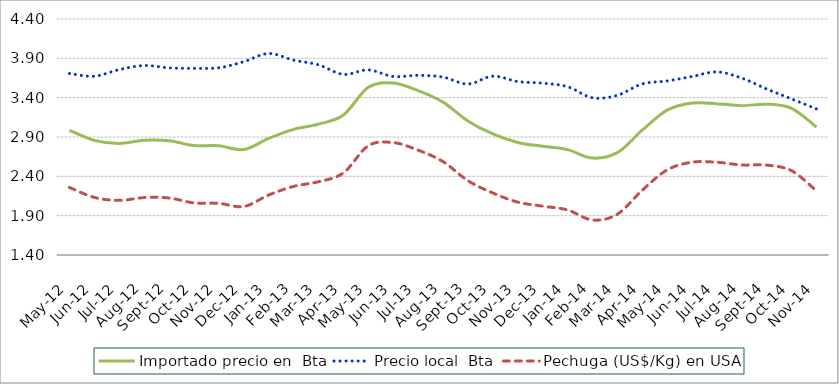
| Category | Importado precio en  Bta  | Precio local  Bta  | Pechuga (US$/Kg) en USA |
|---|---|---|---|
| 2012-05-01 | 2.985 | 3.708 | 2.259 |
| 2012-06-01 | 2.857 | 3.673 | 2.132 |
| 2012-07-01 | 2.817 | 3.757 | 2.094 |
| 2012-08-01 | 2.859 | 3.808 | 2.13 |
| 2012-09-01 | 2.852 | 3.779 | 2.125 |
| 2012-10-01 | 2.791 | 3.772 | 2.063 |
| 2012-11-01 | 2.789 | 3.78 | 2.057 |
| 2012-12-01 | 2.741 | 3.857 | 2.016 |
| 2013-01-01 | 2.882 | 3.961 | 2.163 |
| 2013-02-01 | 2.997 | 3.877 | 2.272 |
| 2013-03-01 | 3.063 | 3.817 | 2.331 |
| 2013-04-01 | 3.18 | 3.696 | 2.443 |
| 2013-05-01 | 3.532 | 3.753 | 2.789 |
| 2013-06-01 | 3.588 | 3.669 | 2.829 |
| 2013-07-01 | 3.489 | 3.684 | 2.733 |
| 2013-08-01 | 3.343 | 3.662 | 2.587 |
| 2013-09-01 | 3.104 | 3.574 | 2.345 |
| 2013-10-01 | 2.938 | 3.673 | 2.189 |
| 2013-11-01 | 2.831 | 3.605 | 2.072 |
| 2013-12-01 | 2.782 | 3.584 | 2.021 |
| 2014-01-01 | 2.74 | 3.54 | 1.972 |
| 2014-02-01 | 2.633 | 3.399 | 1.845 |
| 2014-03-01 | 2.701 | 3.43 | 1.918 |
| 2014-04-01 | 2.986 | 3.575 | 2.223 |
| 2014-05-01 | 3.241 | 3.613 | 2.481 |
| 2014-06-01 | 3.332 | 3.669 | 2.579 |
| 2014-07-01 | 3.324 | 3.727 | 2.579 |
| 2014-08-01 | 3.299 | 3.648 | 2.544 |
| 2014-09-01 | 3.317 | 3.51 | 2.543 |
| 2014-10-01 | 3.264 | 3.384 | 2.471 |
| 2014-11-01 | 3.027 | 3.257 | 2.215 |